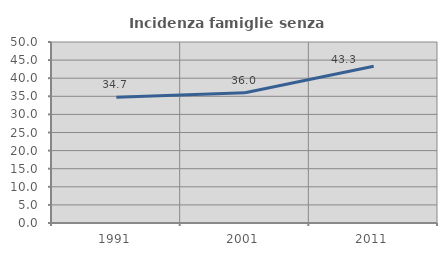
| Category | Incidenza famiglie senza nuclei |
|---|---|
| 1991.0 | 34.742 |
| 2001.0 | 36 |
| 2011.0 | 43.319 |